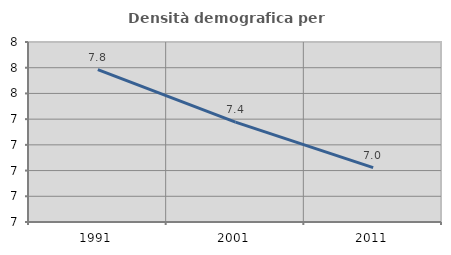
| Category | Densità demografica |
|---|---|
| 1991.0 | 7.785 |
| 2001.0 | 7.377 |
| 2011.0 | 7.023 |